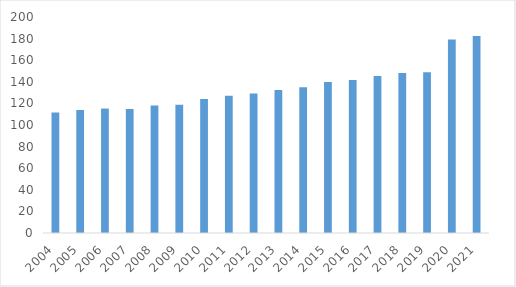
| Category | Deaths / Funeral Home |
|---|---|
| 2004.0 | 111.483 |
| 2005.0 | 113.98 |
| 2006.0 | 115.231 |
| 2007.0 | 114.801 |
| 2008.0 | 118.097 |
| 2009.0 | 118.694 |
| 2010.0 | 124.108 |
| 2011.0 | 127.01 |
| 2012.0 | 129.065 |
| 2013.0 | 132.491 |
| 2014.0 | 134.969 |
| 2015.0 | 139.756 |
| 2016.0 | 141.587 |
| 2017.0 | 145.43 |
| 2018.0 | 148.094 |
| 2019.0 | 148.934 |
| 2020.0 | 179.082 |
| 2021.0 | 182.518 |